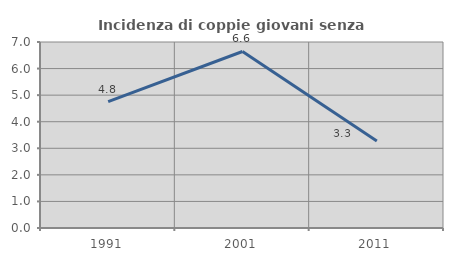
| Category | Incidenza di coppie giovani senza figli |
|---|---|
| 1991.0 | 4.756 |
| 2001.0 | 6.643 |
| 2011.0 | 3.279 |